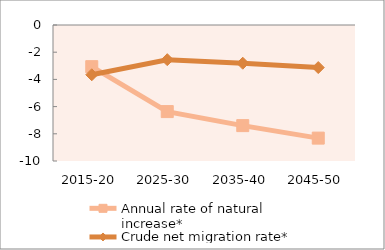
| Category | Annual rate of natural increase* | Crude net migration rate* |
|---|---|---|
| 2015-20 | -3.063 | -3.659 |
| 2025-30 | -6.367 | -2.551 |
| 2035-40 | -7.398 | -2.811 |
| 2045-50 | -8.318 | -3.129 |